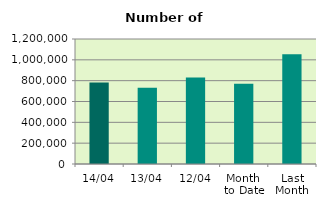
| Category | Series 0 |
|---|---|
| 14/04 | 781962 |
| 13/04 | 733160 |
| 12/04 | 830102 |
| Month 
to Date | 771523 |
| Last
Month | 1053589.478 |